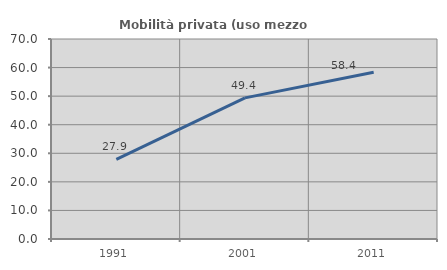
| Category | Mobilità privata (uso mezzo privato) |
|---|---|
| 1991.0 | 27.886 |
| 2001.0 | 49.396 |
| 2011.0 | 58.354 |